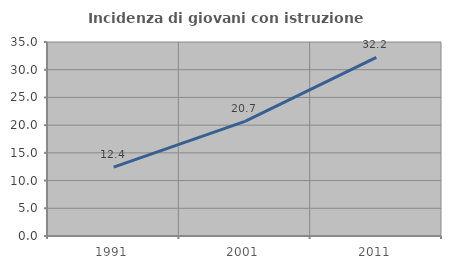
| Category | Incidenza di giovani con istruzione universitaria |
|---|---|
| 1991.0 | 12.426 |
| 2001.0 | 20.677 |
| 2011.0 | 32.216 |